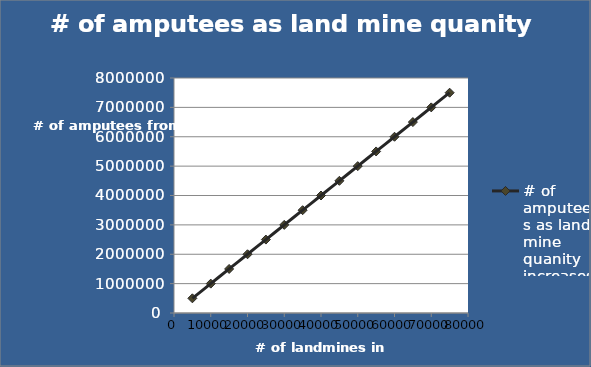
| Category | # of amputees as land mine quanity increases |
|---|---|
| 5000.0 | 500000 |
| 10000.0 | 1000000 |
| 15000.0 | 1500000 |
| 20000.0 | 2000000 |
| 25000.0 | 2500000 |
| 30000.0 | 3000000 |
| 35000.0 | 3500000 |
| 40000.0 | 4000000 |
| 45000.0 | 4500000 |
| 50000.0 | 5000000 |
| 55000.0 | 5500000 |
| 60000.0 | 6000000 |
| 65000.0 | 6500000 |
| 70000.0 | 7000000 |
| 75000.0 | 7500000 |